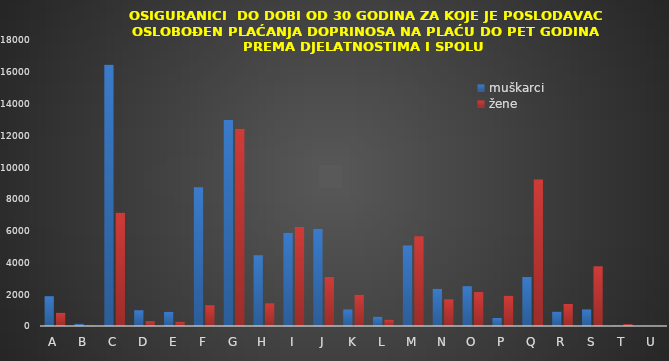
| Category | muškarci | žene |
|---|---|---|
| A | 1875 | 830 |
| B | 136 | 19 |
| C | 16449 | 7133 |
| D | 993 | 301 |
| E | 889 | 263 |
| F | 8739 | 1307 |
| G | 12964 | 12414 |
| H | 4453 | 1426 |
| I | 5867 | 6224 |
| J | 6119 | 3081 |
| K | 1039 | 1969 |
| L | 582 | 407 |
| M | 5070 | 5645 |
| N | 2340 | 1681 |
| O | 2504 | 2136 |
| P | 504 | 1903 |
| Q | 3080 | 9228 |
| R | 901 | 1386 |
| S | 1042 | 3756 |
| T | 21 | 116 |
| U | 9 | 8 |